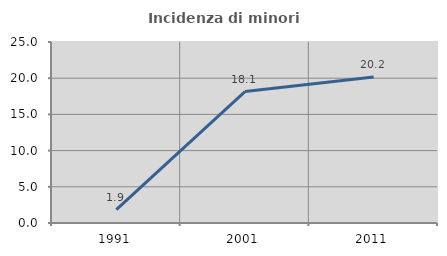
| Category | Incidenza di minori stranieri |
|---|---|
| 1991.0 | 1.852 |
| 2001.0 | 18.149 |
| 2011.0 | 20.169 |